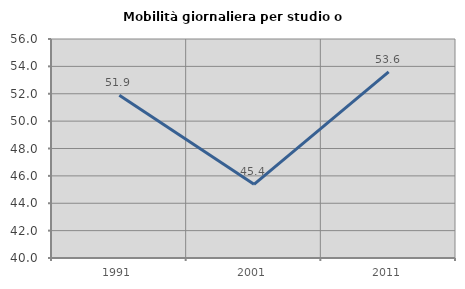
| Category | Mobilità giornaliera per studio o lavoro |
|---|---|
| 1991.0 | 51.898 |
| 2001.0 | 45.384 |
| 2011.0 | 53.6 |